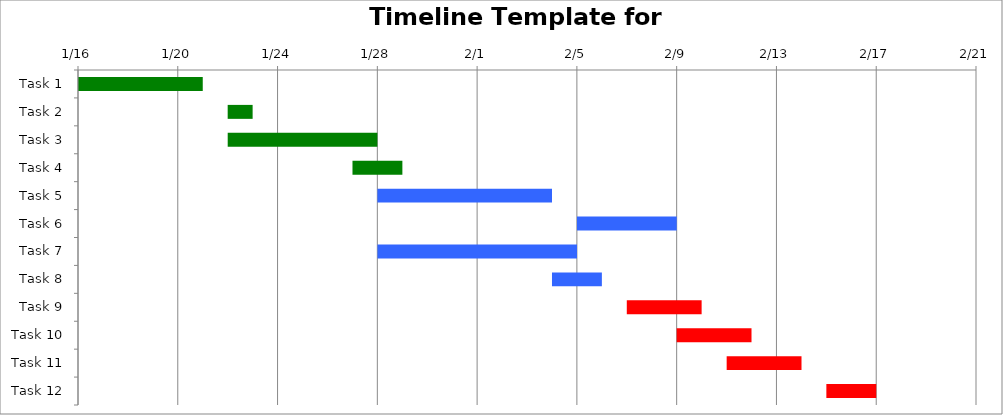
| Category | Start | Duration (days) |
|---|---|---|
| Task 1 | 2015-01-16 | 5 |
| Task 2 | 2015-01-22 | 1 |
| Task 3 | 2015-01-22 | 6 |
| Task 4 | 2015-01-27 | 2 |
| Task 5 | 2015-01-28 | 7 |
| Task 6 | 2015-02-05 | 4 |
| Task 7 | 2015-01-28 | 8 |
| Task 8 | 2015-02-04 | 2 |
| Task 9 | 2015-02-07 | 3 |
| Task 10 | 2015-02-09 | 3 |
| Task 11 | 2015-02-11 | 3 |
| Task 12 | 2015-02-15 | 2 |